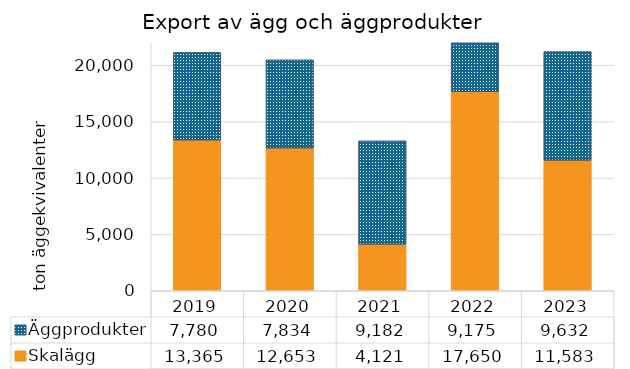
| Category | Skalägg | Äggprodukter |
|---|---|---|
| 2019 | 13365 | 7780.24 |
| 2020 | 12653 | 7833.54 |
| 2021 | 4121 | 9182.3 |
| 2022 | 17650 | 9174.58 |
| 2023 | 11583 | 9632.12 |